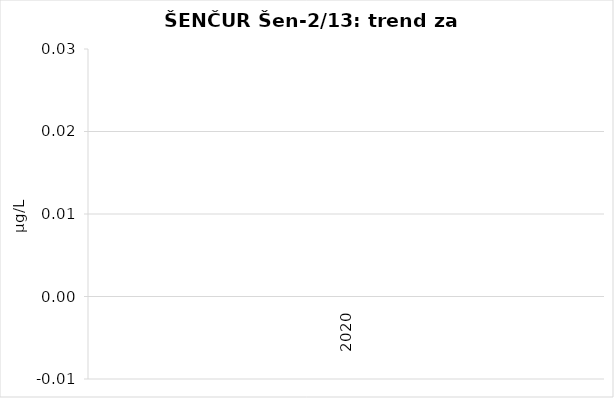
| Category | Vsota |
|---|---|
| 2020 | 0 |